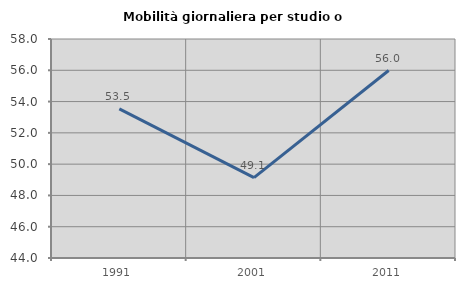
| Category | Mobilità giornaliera per studio o lavoro |
|---|---|
| 1991.0 | 53.535 |
| 2001.0 | 49.135 |
| 2011.0 | 55.985 |